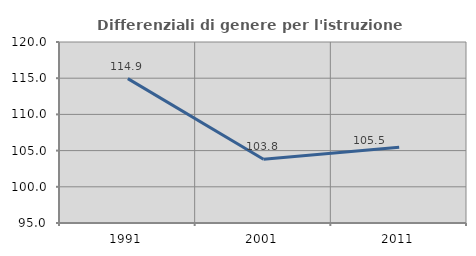
| Category | Differenziali di genere per l'istruzione superiore |
|---|---|
| 1991.0 | 114.945 |
| 2001.0 | 103.806 |
| 2011.0 | 105.465 |